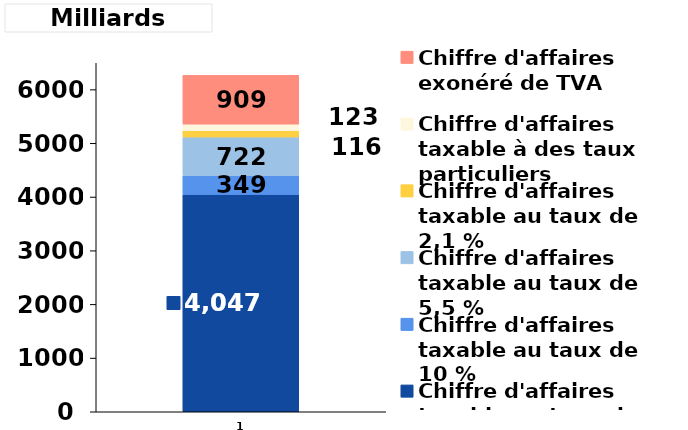
| Category | Chiffre d'affaires taxable au taux de 20 % | Chiffre d'affaires taxable au taux de 10 % | Chiffre d'affaires taxable au taux de 5,5 % | Chiffre d'affaires taxable au taux de 2,1 % | Chiffre d'affaires taxable à des taux particuliers | Chiffre d'affaires exonéré de TVA |
|---|---|---|---|---|---|---|
| 0 | 4047.298 | 348.691 | 722.088 | 116.085 | 122.807 | 909.225 |